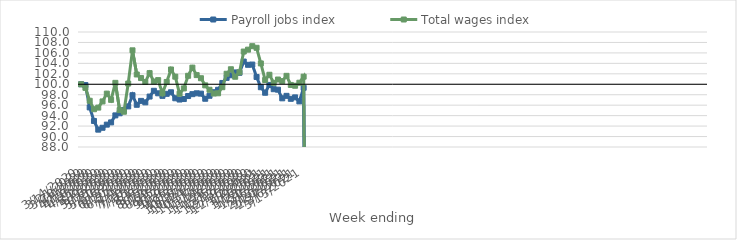
| Category | Payroll jobs index | Total wages index |
|---|---|---|
| 14/03/2020 | 100 | 100 |
| 21/03/2020 | 99.849 | 99.318 |
| 28/03/2020 | 95.574 | 96.843 |
| 04/04/2020 | 92.981 | 95.225 |
| 11/04/2020 | 91.321 | 95.538 |
| 18/04/2020 | 91.677 | 96.717 |
| 25/04/2020 | 92.279 | 98.211 |
| 02/05/2020 | 92.71 | 97.018 |
| 09/05/2020 | 94.048 | 100.272 |
| 16/05/2020 | 94.452 | 95.064 |
| 23/05/2020 | 95.104 | 94.745 |
| 30/05/2020 | 95.764 | 100.14 |
| 06/06/2020 | 97.908 | 106.493 |
| 13/06/2020 | 96.076 | 101.873 |
| 20/06/2020 | 96.823 | 101.188 |
| 27/06/2020 | 96.543 | 100.439 |
| 04/07/2020 | 97.652 | 102.134 |
| 11/07/2020 | 98.751 | 100.521 |
| 18/07/2020 | 98.272 | 100.796 |
| 25/07/2020 | 97.781 | 98.277 |
| 01/08/2020 | 98.171 | 100.443 |
| 08/08/2020 | 98.468 | 102.829 |
| 15/08/2020 | 97.32 | 101.456 |
| 22/08/2020 | 97.079 | 98.201 |
| 29/08/2020 | 97.176 | 99.211 |
| 05/09/2020 | 97.748 | 101.623 |
| 12/09/2020 | 98.109 | 103.184 |
| 19/09/2020 | 98.273 | 101.756 |
| 26/09/2020 | 98.21 | 101.157 |
| 03/10/2020 | 97.229 | 99.791 |
| 10/10/2020 | 97.799 | 98.95 |
| 17/10/2020 | 98.483 | 98.226 |
| 24/10/2020 | 98.945 | 98.275 |
| 31/10/2020 | 100.252 | 99.437 |
| 07/11/2020 | 101.225 | 102.011 |
| 14/11/2020 | 101.726 | 102.871 |
| 21/11/2020 | 102.266 | 101.441 |
| 28/11/2020 | 102.197 | 102.297 |
| 05/12/2020 | 104.347 | 106.258 |
| 12/12/2020 | 103.724 | 106.623 |
| 19/12/2020 | 103.772 | 107.286 |
| 26/12/2020 | 101.4 | 106.975 |
| 02/01/2021 | 99.436 | 103.987 |
| 09/01/2021 | 98.38 | 100.818 |
| 16/01/2021 | 99.876 | 101.821 |
| 23/01/2021 | 99.057 | 100.274 |
| 30/01/2021 | 98.965 | 100.908 |
| 06/02/2021 | 97.312 | 100.603 |
| 13/02/2021 | 97.786 | 101.614 |
| 20/02/2021 | 97.216 | 99.876 |
| 27/02/2021 | 97.494 | 99.72 |
| 06/03/2021 | 96.727 | 100.297 |
| 13/03/2021 | 99.328 | 101.453 |